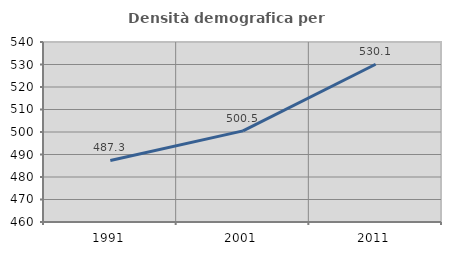
| Category | Densità demografica |
|---|---|
| 1991.0 | 487.346 |
| 2001.0 | 500.504 |
| 2011.0 | 530.108 |